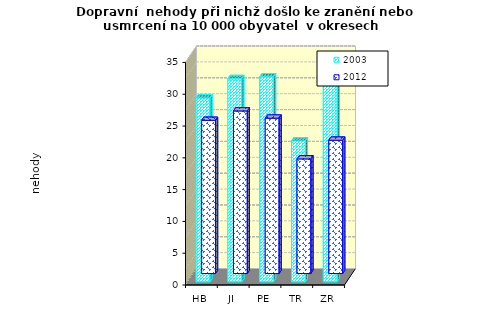
| Category | 2003 | 2012 |
|---|---|---|
| HB | 28.908 | 24.093 |
| JI | 31.959 | 25.57 |
| PE | 32.234 | 24.435 |
| TR | 22.148 | 18.029 |
| ZR | 32.082 | 20.968 |